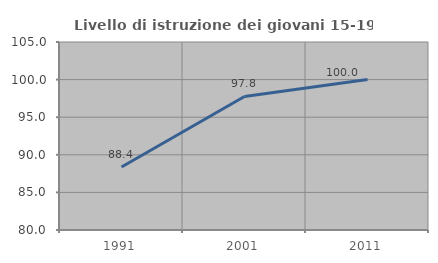
| Category | Livello di istruzione dei giovani 15-19 anni |
|---|---|
| 1991.0 | 88.387 |
| 2001.0 | 97.761 |
| 2011.0 | 100 |